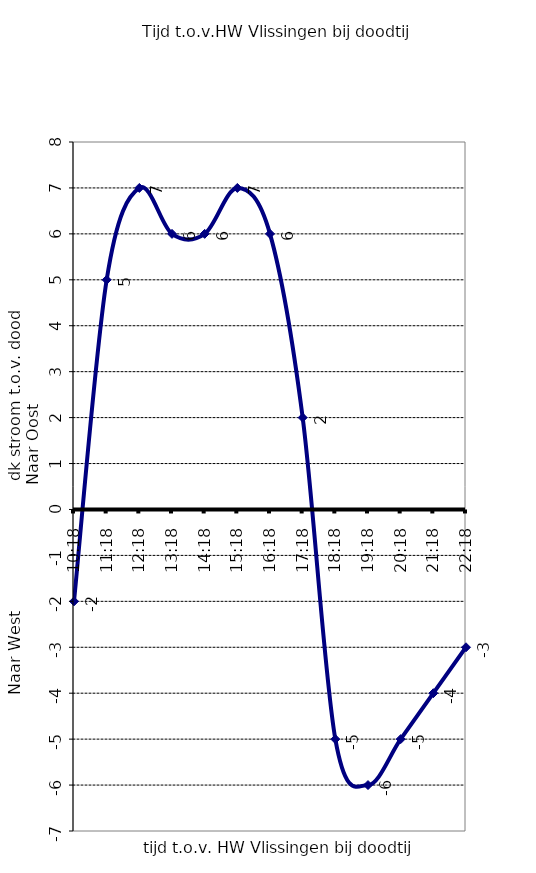
| Category | Series 0 |
|---|---|
| 1900-01-06 10:18:00 | -2 |
| 1900-01-05 11:18:00 | 5 |
| 1900-01-04 12:18:00 | 7 |
| 1900-01-03 13:18:00 | 6 |
| 1900-01-02 14:18:00 | 6 |
| 1900-01-01 15:18:00 | 7 |
| 0.6791666666666667 | 6 |
| 1900-01-01 17:18:00 | 2 |
| 1900-01-02 18:18:00 | -5 |
| 1900-01-03 19:18:00 | -6 |
| 1900-01-04 20:18:00 | -5 |
| 1900-01-05 21:18:00 | -4 |
| 1900-01-06 22:18:00 | -3 |